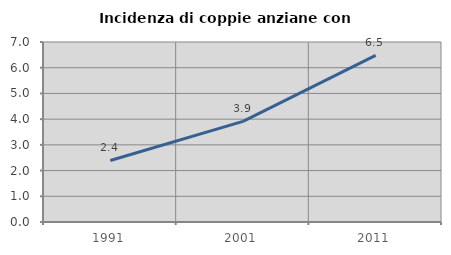
| Category | Incidenza di coppie anziane con figli |
|---|---|
| 1991.0 | 2.392 |
| 2001.0 | 3.913 |
| 2011.0 | 6.481 |